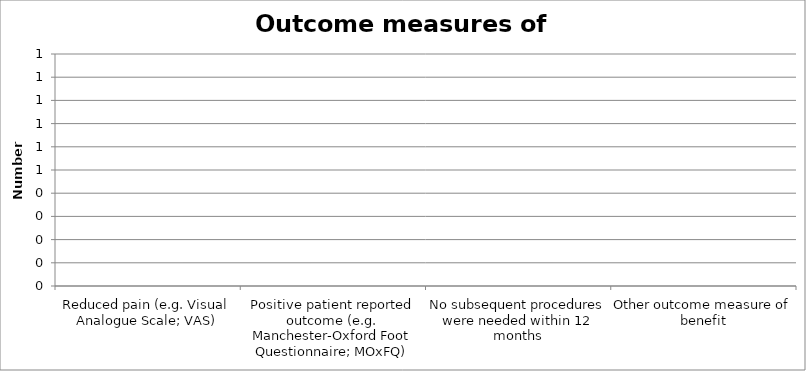
| Category | Series 0 |
|---|---|
| Reduced pain (e.g. Visual Analogue Scale; VAS) | 0 |
| Positive patient reported outcome (e.g. Manchester-Oxford Foot Questionnaire; MOxFQ) | 0 |
| No subsequent procedures were needed within 12 months | 0 |
| Other outcome measure of benefit | 0 |